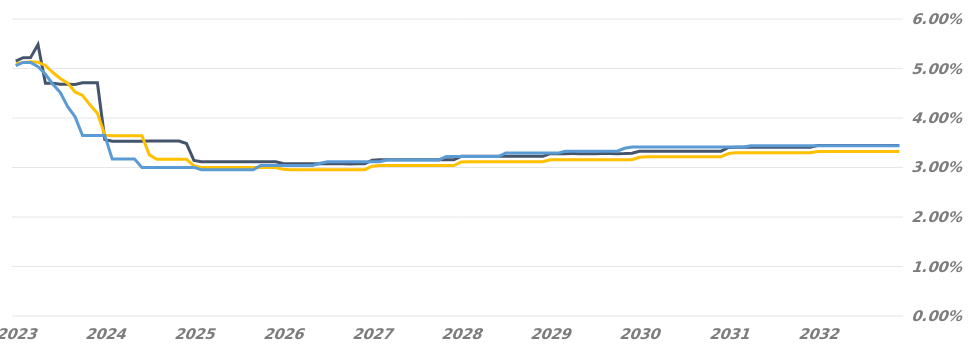
| Category | Resets |
|---|---|
| 2023-05-22 | 0.051 |
| 2023-06-22 | 0.051 |
| 2023-07-22 | 0.051 |
| 2023-08-22 | 0.05 |
| 2023-09-22 | 0.049 |
| 2023-10-22 | 0.047 |
| 2023-11-22 | 0.045 |
| 2023-12-22 | 0.042 |
| 2024-01-22 | 0.04 |
| 2024-02-22 | 0.036 |
| 2024-03-22 | 0.036 |
| 2024-04-22 | 0.036 |
| 2024-05-22 | 0.036 |
| 2024-06-22 | 0.032 |
| 2024-07-22 | 0.032 |
| 2024-08-22 | 0.032 |
| 2024-09-22 | 0.032 |
| 2024-10-22 | 0.03 |
| 2024-11-22 | 0.03 |
| 2024-12-22 | 0.03 |
| 2025-01-22 | 0.03 |
| 2025-02-22 | 0.03 |
| 2025-03-22 | 0.03 |
| 2025-04-22 | 0.03 |
| 2025-05-22 | 0.03 |
| 2025-06-22 | 0.03 |
| 2025-07-22 | 0.03 |
| 2025-08-22 | 0.03 |
| 2025-09-22 | 0.03 |
| 2025-10-22 | 0.03 |
| 2025-11-22 | 0.03 |
| 2025-12-22 | 0.03 |
| 2026-01-22 | 0.03 |
| 2026-02-22 | 0.03 |
| 2026-03-22 | 0.03 |
| 2026-04-22 | 0.03 |
| 2026-05-22 | 0.03 |
| 2026-06-22 | 0.03 |
| 2026-07-22 | 0.03 |
| 2026-08-22 | 0.03 |
| 2026-09-22 | 0.03 |
| 2026-10-22 | 0.031 |
| 2026-11-22 | 0.031 |
| 2026-12-22 | 0.031 |
| 2027-01-22 | 0.031 |
| 2027-02-22 | 0.031 |
| 2027-03-22 | 0.031 |
| 2027-04-22 | 0.031 |
| 2027-05-22 | 0.031 |
| 2027-06-22 | 0.031 |
| 2027-07-22 | 0.032 |
| 2027-08-22 | 0.032 |
| 2027-09-22 | 0.032 |
| 2027-10-22 | 0.032 |
| 2027-11-22 | 0.032 |
| 2027-12-22 | 0.032 |
| 2028-01-22 | 0.032 |
| 2028-02-22 | 0.032 |
| 2028-03-22 | 0.032 |
| 2028-04-22 | 0.032 |
| 2028-05-22 | 0.032 |
| 2028-06-22 | 0.032 |
| 2028-07-22 | 0.032 |
| 2028-08-22 | 0.032 |
| 2028-09-22 | 0.032 |
| 2028-10-22 | 0.032 |
| 2028-11-22 | 0.033 |
| 2028-12-22 | 0.033 |
| 2029-01-22 | 0.033 |
| 2029-02-22 | 0.033 |
| 2029-03-22 | 0.033 |
| 2029-04-22 | 0.033 |
| 2029-05-22 | 0.033 |
| 2029-06-22 | 0.033 |
| 2029-07-22 | 0.033 |
| 2029-08-22 | 0.033 |
| 2029-09-22 | 0.033 |
| 2029-10-22 | 0.033 |
| 2029-11-22 | 0.033 |
| 2029-12-22 | 0.033 |
| 2030-01-22 | 0.033 |
| 2030-02-22 | 0.033 |
| 2030-03-22 | 0.034 |
| 2030-04-22 | 0.034 |
| 2030-05-22 | 0.034 |
| 2030-06-22 | 0.034 |
| 2030-07-22 | 0.034 |
| 2030-08-22 | 0.034 |
| 2030-09-22 | 0.034 |
| 2030-10-22 | 0.034 |
| 2030-11-22 | 0.034 |
| 2030-12-22 | 0.034 |
| 2031-01-22 | 0.034 |
| 2031-02-22 | 0.034 |
| 2031-03-22 | 0.034 |
| 2031-04-22 | 0.034 |
| 2031-05-22 | 0.034 |
| 2031-06-22 | 0.034 |
| 2031-07-22 | 0.034 |
| 2031-08-22 | 0.034 |
| 2031-09-22 | 0.034 |
| 2031-10-22 | 0.034 |
| 2031-11-22 | 0.034 |
| 2031-12-22 | 0.034 |
| 2032-01-22 | 0.034 |
| 2032-02-22 | 0.034 |
| 2032-03-22 | 0.034 |
| 2032-04-22 | 0.034 |
| 2032-05-22 | 0.034 |
| 2032-06-22 | 0.034 |
| 2032-07-22 | 0.034 |
| 2032-08-22 | 0.034 |
| 2032-09-22 | 0.034 |
| 2032-10-22 | 0.034 |
| 2032-11-22 | 0.034 |
| 2032-12-22 | 0.034 |
| 2033-01-22 | 0.034 |
| 2033-02-22 | 0.034 |
| 2033-03-22 | 0.034 |
| 2033-04-22 | 0.034 |